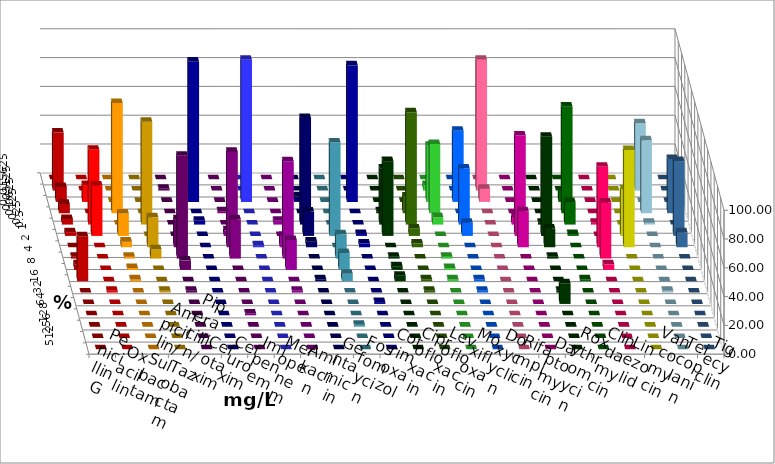
| Category | Penicillin G | Oxacillin | Ampicillin/ Sulbactam | Piperacillin/ Tazobactam | Cefotaxim | Cefuroxim | Imipenem | Meropenem | Amikacin | Gentamicin | Fosfomycin | Cotrimoxazol | Ciprofloxacin | Levofloxacin | Moxifloxacin | Doxycyclin | Rifampicin | Daptomycin | Roxythromycin | Clindamycin | Linezolid | Vancomycin | Teicoplanin | Tigecyclin |
|---|---|---|---|---|---|---|---|---|---|---|---|---|---|---|---|---|---|---|---|---|---|---|---|---|
| 0.015625 | 0 | 0 | 0 | 0 | 0 | 0 | 0 | 0 | 0 | 0 | 0 | 0 | 0 | 0 | 0 | 0 | 0 | 0 | 0 | 0 | 0 | 0 | 0 | 0 |
| 0.03125 | 40.26 | 0 | 0 | 0 | 1.299 | 0 | 0 | 0 | 0 | 0 | 0 | 0 | 0 | 0 | 3.896 | 0 | 90.909 | 0 | 0 | 0 | 0 | 0 | 0 | 46.753 |
| 0.0625 | 10.39 | 11.688 | 0 | 0 | 0 | 0 | 97.403 | 98.701 | 0 | 3.896 | 0 | 94.805 | 0 | 0 | 38.961 | 49.351 | 9.091 | 0 | 0 | 7.792 | 0 | 0 | 0 | 0 |
| 0.125 | 6.494 | 0 | 76.623 | 0 | 0 | 1.299 | 0 | 0 | 0 | 0 | 0 | 0 | 1.299 | 11.688 | 48.052 | 0 | 0 | 0 | 0 | 74.026 | 0 | 0 | 37.662 | 50.649 |
| 0.25 | 3.896 | 51.948 | 0 | 71.429 | 0 | 0 | 2.597 | 0 | 2.597 | 74.026 | 0 | 0 | 38.961 | 77.922 | 5.195 | 38.961 | 0 | 5.263 | 1.299 | 15.584 | 1.299 | 0 | 0 | 1.299 |
| 0.5 | 2.597 | 35.065 | 15.584 | 0 | 0 | 3.896 | 0 | 0 | 0 | 16.883 | 64.935 | 1.299 | 51.948 | 5.195 | 0 | 9.091 | 0 | 69.737 | 68.831 | 1.299 | 0 | 32.468 | 51.948 | 0 |
| 1.0 | 0 | 0 | 3.896 | 20.779 | 19.481 | 66.234 | 0 | 1.299 | 7.792 | 3.896 | 0 | 2.597 | 0 | 2.597 | 0 | 0 | 0 | 25 | 12.987 | 0 | 55.844 | 67.532 | 10.39 | 0 |
| 2.0 | 1.299 | 0 | 1.299 | 6.494 | 71.429 | 27.273 | 0 | 0 | 67.532 | 0 | 16.883 | 0 | 1.299 | 0 | 1.299 | 0 | 0 | 0 | 1.299 | 0 | 38.961 | 0 | 0 | 0 |
| 4.0 | 3.896 | 0 | 1.299 | 0 | 6.494 | 0 | 0 | 0 | 20.779 | 0 | 11.688 | 0 | 2.597 | 0 | 1.299 | 0 | 0 | 0 | 0 | 0 | 3.896 | 0 | 0 | 0 |
| 8.0 | 31.169 | 0 | 1.299 | 0 | 0 | 0 | 0 | 0 | 0 | 1.299 | 5.195 | 0 | 3.896 | 1.299 | 1.299 | 1.299 | 0 | 0 | 0 | 1.299 | 0 | 0 | 0 | 0 |
| 16.0 | 0 | 1.299 | 0 | 1.299 | 1.299 | 0 | 0 | 0 | 1.299 | 0 | 0 | 0 | 0 | 1.299 | 0 | 1.299 | 0 | 0 | 1.299 | 0 | 0 | 0 | 0 | 1.299 |
| 32.0 | 0 | 0 | 0 | 0 | 0 | 0 | 0 | 0 | 0 | 0 | 0 | 1.299 | 0 | 0 | 0 | 0 | 0 | 0 | 14.286 | 0 | 0 | 0 | 0 | 0 |
| 64.0 | 0 | 0 | 0 | 0 | 0 | 1.299 | 0 | 0 | 0 | 0 | 0 | 0 | 0 | 0 | 0 | 0 | 0 | 0 | 0 | 0 | 0 | 0 | 0 | 0 |
| 128.0 | 0 | 0 | 0 | 0 | 0 | 0 | 0 | 0 | 0 | 0 | 1.299 | 0 | 0 | 0 | 0 | 0 | 0 | 0 | 0 | 0 | 0 | 0 | 0 | 0 |
| 256.0 | 0 | 0 | 0 | 0 | 0 | 0 | 0 | 0 | 0 | 0 | 0 | 0 | 0 | 0 | 0 | 0 | 0 | 0 | 0 | 0 | 0 | 0 | 0 | 0 |
| 512.0 | 0 | 0 | 0 | 0 | 0 | 0 | 0 | 0 | 0 | 0 | 0 | 0 | 0 | 0 | 0 | 0 | 0 | 0 | 0 | 0 | 0 | 0 | 0 | 0 |